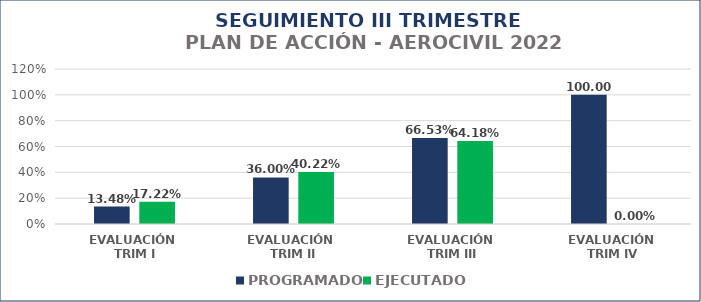
| Category | PROGRAMADO | EJECUTADO |
|---|---|---|
| EVALUACIÓN 
TRIM I | 0.135 | 0.172 |
| EVALUACIÓN 
TRIM II | 0.36 | 0.402 |
| EVALUACIÓN 
TRIM III | 0.665 | 0.642 |
| EVALUACIÓN
 TRIM IV | 1 | 0 |